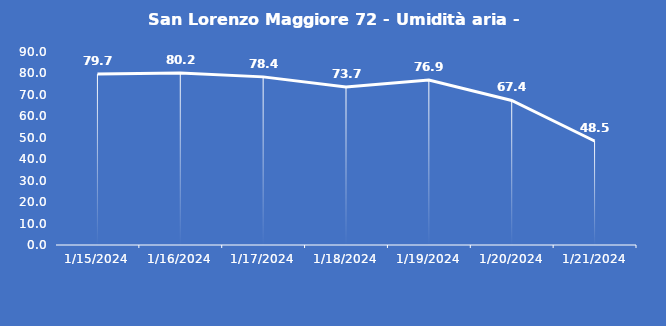
| Category | San Lorenzo Maggiore 72 - Umidità aria - Grezzo (%) |
|---|---|
| 1/15/24 | 79.7 |
| 1/16/24 | 80.2 |
| 1/17/24 | 78.4 |
| 1/18/24 | 73.7 |
| 1/19/24 | 76.9 |
| 1/20/24 | 67.4 |
| 1/21/24 | 48.5 |